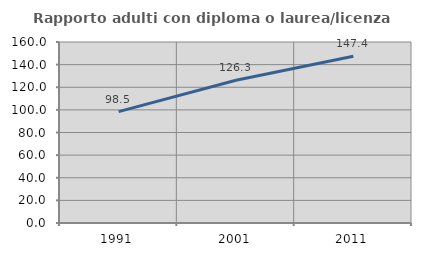
| Category | Rapporto adulti con diploma o laurea/licenza media  |
|---|---|
| 1991.0 | 98.462 |
| 2001.0 | 126.25 |
| 2011.0 | 147.368 |